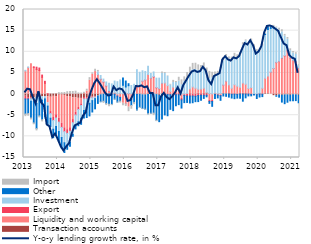
| Category | Transaction accounts | Liquidity and working capital | Export | Investment | Other | Import |
|---|---|---|---|---|---|---|
| 2013-01-01 | -0.509 | 5.466 | -0.655 | 0.157 | -3.557 | -0.62 |
| 2013-02-01 | -0.821 | 6.307 | -0.351 | 0.101 | -3.442 | -0.636 |
| 2013-03-01 | -0.908 | 7.144 | -0.174 | -0.604 | -3.955 | -0.473 |
| 2013-04-01 | -0.906 | 6.265 | 0.188 | -0.805 | -5.11 | -0.441 |
| 2013-05-01 | -1.028 | 5.791 | 0.566 | -1.205 | -5.942 | -0.539 |
| 2013-06-01 | -0.715 | 5.566 | 0.59 | -0.246 | -4.209 | -0.467 |
| 2013-07-01 | -0.656 | 3.962 | 0.527 | -0.788 | -4.619 | -0.522 |
| 2013-08-01 | -0.571 | 2.543 | 0.475 | -0.574 | -4.455 | -0.211 |
| 2013-09-01 | -0.597 | -1.463 | 0.046 | -0.788 | -4.325 | -0.17 |
| 2013-10-01 | -0.731 | -3.405 | -0.479 | -1.101 | -1.998 | -0.034 |
| 2013-11-01 | -0.534 | -5.012 | -0.697 | -2.071 | -1.999 | 0.032 |
| 2013-12-01 | -0.631 | -4.25 | -0.793 | -2 | -1.812 | 0.042 |
| 2014-01-01 | -0.248 | -5.468 | -0.921 | -2.223 | -2.314 | 0.338 |
| 2014-02-01 | -0.244 | -6.677 | -0.967 | -2.397 | -2.478 | 0.345 |
| 2014-03-01 | -0.312 | -7.664 | -0.914 | -2.634 | -2.299 | 0.368 |
| 2014-04-01 | -0.598 | -7.82 | -0.878 | -2.779 | -0.977 | 0.561 |
| 2014-05-01 | -0.678 | -7.271 | -0.835 | -2.63 | -0.953 | 0.634 |
| 2014-06-01 | -0.89 | -5.133 | -0.763 | -2.735 | -0.458 | 0.61 |
| 2014-07-01 | -0.861 | -3.427 | -0.672 | -2.518 | -0.758 | 0.681 |
| 2014-08-01 | -1.004 | -2.174 | -0.467 | -2.918 | -0.917 | 0.276 |
| 2014-09-01 | -1.021 | -1.308 | -0.375 | -3.018 | -1.426 | 0.243 |
| 2014-10-01 | -0.819 | 0.161 | -0.34 | -2.752 | -1.718 | 0.247 |
| 2014-11-01 | -0.858 | 0.695 | -0.279 | -2.093 | -2.317 | 0.459 |
| 2014-12-01 | -0.577 | 3.263 | -0.264 | -1.35 | -2.967 | 0.625 |
| 2015-01-01 | -0.712 | 4.673 | -0.142 | -0.704 | -2.68 | 0.34 |
| 2015-02-01 | -0.565 | 5.321 | -0.111 | -0.407 | -2.409 | 0.553 |
| 2015-03-01 | -0.434 | 4.59 | 0.008 | 0.669 | -1.773 | 0.324 |
| 2015-04-01 | -0.175 | 3.498 | 0.044 | 0.845 | -1.638 | -0.132 |
| 2015-05-01 | -0.054 | 2.82 | 0.068 | 0.654 | -1.651 | -0.488 |
| 2015-06-01 | 0.05 | 1.84 | 0.063 | 0.904 | -2.258 | -0.459 |
| 2015-07-01 | 0.129 | 0.502 | 0.07 | 1.849 | -2.403 | -0.592 |
| 2015-08-01 | 0.104 | 0.009 | -0.067 | 2.291 | -2.376 | -0.307 |
| 2015-09-01 | 0.112 | 0.208 | -0.055 | 2.751 | -1.148 | -0.214 |
| 2015-10-01 | 0.038 | -0.411 | -0.06 | 2.883 | -1.421 | -0.215 |
| 2015-11-01 | 0.131 | -0.703 | -0.076 | 3.2 | -0.895 | -0.44 |
| 2015-12-01 | 0.06 | -2.198 | 0.008 | 2.045 | 1.664 | -0.542 |
| 2016-01-01 | 0.112 | -2.269 | -0.03 | 1.566 | 1.404 | -0.65 |
| 2016-02-01 | 0.086 | -3.097 | 0.005 | 1.894 | 0.462 | -1.069 |
| 2016-03-01 | 0.054 | -1.187 | -0.022 | 1.97 | -1.494 | -0.878 |
| 2016-04-01 | 0.002 | 0.259 | -0.024 | 2.055 | -1.952 | -0.542 |
| 2016-05-01 | -0.049 | 2.232 | -0.014 | 3.525 | -3.719 | -0.201 |
| 2016-06-01 | -0.049 | 2.038 | 0.004 | 3.11 | -3.101 | -0.262 |
| 2016-07-01 | -0.188 | 3.046 | 0.004 | 2.456 | -3.237 | -0.159 |
| 2016-08-01 | -0.222 | 3.353 | 0.003 | 1.994 | -3.361 | -0.259 |
| 2016-09-01 | -0.107 | 4.637 | 0.003 | 1.923 | -4.549 | -0.209 |
| 2016-10-01 | -0.069 | 3.752 | 0.02 | 1.099 | -4.471 | -0.197 |
| 2016-11-01 | 0.003 | 4.032 | 0.118 | 1.076 | -4.499 | -0.6 |
| 2016-12-01 | -0.126 | 1.493 | 0.07 | 2.199 | -6.059 | -0.332 |
| 2017-01-01 | -0.287 | 1.255 | 0.034 | 2.468 | -6.239 | 0.016 |
| 2017-02-01 | -0.028 | 2.502 | 0.033 | 2.337 | -5.845 | 0.328 |
| 2017-03-01 | -0.212 | 2.639 | -0.061 | 2.218 | -4.66 | 0.242 |
| 2017-04-01 | 0.006 | 1.986 | -0.118 | 2.178 | -5.005 | 0.123 |
| 2017-05-01 | -0.021 | 0.622 | -0.131 | 1.488 | -3.457 | 0.202 |
| 2017-06-01 | -0.058 | 1.637 | -0.146 | 1.1 | -3.715 | 0.504 |
| 2017-07-01 | 0.066 | 0.742 | -0.146 | 1.936 | -2.615 | 0.257 |
| 2017-08-01 | 0.095 | 1.091 | -0.147 | 1.891 | -2.348 | 0.891 |
| 2017-09-01 | -0.033 | -1.003 | -0.338 | 2.229 | -1.931 | 1.128 |
| 2017-10-01 | 0.035 | -0.002 | -0.349 | 2.95 | -1.675 | 1.076 |
| 2017-11-01 | -0.038 | 0.191 | -0.423 | 3.298 | -1.519 | 1.614 |
| 2017-12-01 | 0.111 | 1.115 | -0.472 | 3.68 | -1.636 | 1.452 |
| 2018-01-01 | -0.017 | 1.678 | -0.449 | 4.093 | -1.582 | 1.485 |
| 2018-02-01 | -0.076 | 1.395 | -0.446 | 4.432 | -1.275 | 1.464 |
| 2018-03-01 | 0.181 | 0.968 | -0.353 | 4.465 | -1.426 | 1.286 |
| 2018-04-01 | 0.071 | 1.103 | -0.297 | 4.181 | -1.141 | 1.381 |
| 2018-05-01 | 0.137 | 1.251 | -0.296 | 4.4 | -0.726 | 1.574 |
| 2018-06-01 | 0.284 | 0.134 | -0.277 | 4.559 | -0.377 | 1.191 |
| 2018-07-01 | 0.145 | -1.444 | -0.282 | 3.523 | -0.476 | 1.691 |
| 2018-08-01 | 0.047 | -1.482 | -0.277 | 3.826 | -1.138 | 1.281 |
| 2018-09-01 | 0.187 | 0.07 | -0.088 | 3.999 | -0.981 | 0.962 |
| 2018-10-01 | 0.165 | -0.154 | -0.086 | 4.312 | -0.67 | 0.902 |
| 2018-11-01 | 0.151 | -0.294 | -0.083 | 5.778 | -1.1 | 0.383 |
| 2018-12-01 | 0.121 | 2.002 | 0.005 | 5.72 | -0.449 | 0.69 |
| 2019-01-01 | 0.084 | 2.964 | 0.003 | 5.799 | -0.532 | 0.511 |
| 2019-02-01 | 0.122 | 2.071 | -0.001 | 6.112 | -0.71 | 0.483 |
| 2019-03-01 | -0.043 | 1.384 | -0.007 | 6.432 | -0.89 | 0.926 |
| 2019-04-01 | -0.017 | 2.209 | -0.007 | 6.458 | -1.061 | 0.975 |
| 2019-05-01 | -0.065 | 1.864 | -0.007 | 6.82 | -0.881 | 0.597 |
| 2019-06-01 | 0.071 | 1.52 | -0.011 | 7.649 | -0.954 | 0.599 |
| 2019-07-01 | 0.174 | 2.439 | -0.011 | 8.965 | -1.672 | 0.577 |
| 2019-08-01 | 0.114 | 2.222 | -0.011 | 10.233 | -0.877 | 0.238 |
| 2019-09-01 | 0.013 | 1.329 | -0.011 | 10.479 | -0.423 | 0.206 |
| 2019-10-31 | -0.066 | 1.541 | -0.01 | 11.047 | -0.342 | 0.436 |
| 2019-11-30 | -0.091 | 0.084 | -0.01 | 10.759 | -0.137 | 0.843 |
| 2019-12-31 | -0.112 | -0.022 | -0.01 | 10.098 | -0.896 | 0.408 |
| 2020-01-31 | 0.054 | 0.141 | -0.01 | 9.923 | -0.677 | 0.532 |
| 2020-02-29 | -0.038 | 1.384 | -0.005 | 9.987 | -0.557 | 0.483 |
| 2020-03-31 | 0.142 | 3.609 | 0 | 10.341 | 0.142 | 0.224 |
| 2020-04-30 | 0.16 | 4.087 | 0 | 11.041 | 0.559 | 0.149 |
| 2020-05-31 | -0.034 | 5.187 | 0.005 | 10.338 | 0.308 | 0.306 |
| 2020-06-30 | -0.38 | 6.042 | 0.022 | 9.534 | 0.223 | 0.414 |
| 2020-07-31 | -0.388 | 7.439 | 0.076 | 8.138 | -0.127 | 0.2 |
| 2020-08-31 | -0.211 | 7.694 | 0.075 | 7.348 | -0.512 | 0.459 |
| 2020-09-30 | -0.276 | 8.456 | 0.072 | 6.174 | -1.624 | 0.508 |
| 2020-10-31 | -0.209 | 9.015 | 0.061 | 4.618 | -2.062 | 0.415 |
| 2020-11-30 | -0.198 | 10.255 | 0.062 | 2.65 | -1.729 | 0.415 |
| 2020-12-31 | -0.289 | 8.536 | 0.053 | 1.68 | -1.31 | 0.431 |
| 2021-01-31 | -0.187 | 7.94 | 0.055 | 1.703 | -1.365 | 0.346 |
| 2021-02-28 | -0.182 | 7.661 | 0.056 | 1.682 | -1.362 | 0.377 |
| 2021-03-31 | -0.281 | 6.083 | 0.055 | 0.556 | -1.747 | 0.244 |